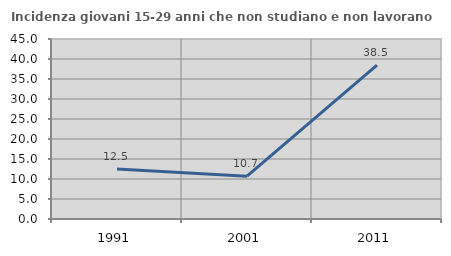
| Category | Incidenza giovani 15-29 anni che non studiano e non lavorano  |
|---|---|
| 1991.0 | 12.5 |
| 2001.0 | 10.714 |
| 2011.0 | 38.462 |